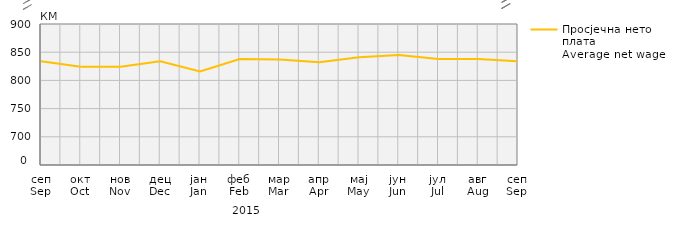
| Category | Просјечна нето плата
Average net wage |
|---|---|
| сеп
Sep | 834 |
| окт
Oct | 824 |
| нов
Nov | 824 |
| дец
Dec | 834 |
| јан
Jan | 816 |
| феб
Feb | 838 |
| мар
Mar | 837 |
| апр
Apr | 832 |
| мај
May | 841 |
| јун
Jun | 845 |
| јул
Jul | 838 |
| авг
Aug | 838 |
| сеп
Sep | 834 |